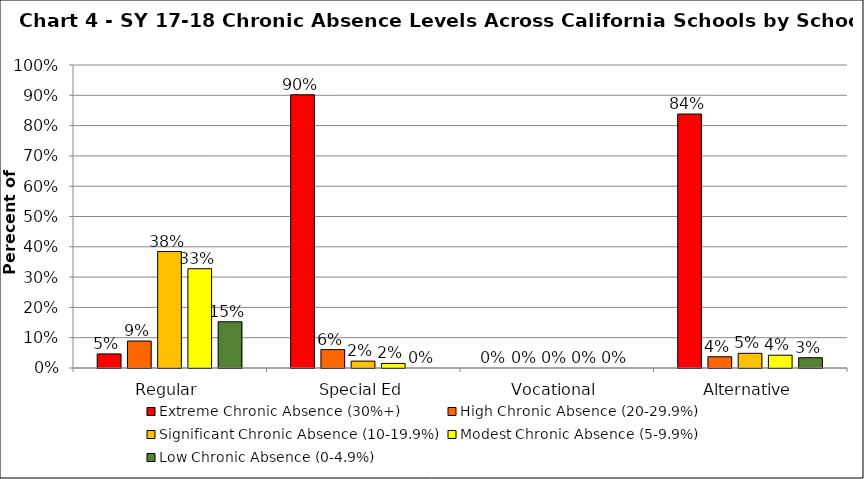
| Category | Extreme Chronic Absence (30%+) | High Chronic Absence (20-29.9%) | Significant Chronic Absence (10-19.9%) | Modest Chronic Absence (5-9.9%) | Low Chronic Absence (0-4.9%) |
|---|---|---|---|---|---|
| 0 | 0.046 | 0.089 | 0.384 | 0.328 | 0.153 |
| 1 | 0.902 | 0.061 | 0.023 | 0.015 | 0 |
| 2 | 0 | 0 | 0 | 0 | 0 |
| 3 | 0.838 | 0.037 | 0.048 | 0.042 | 0.034 |